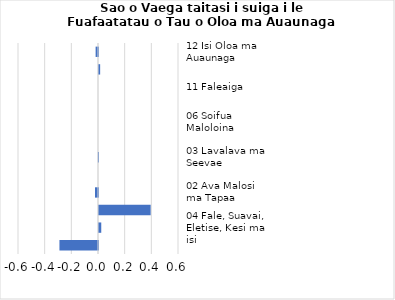
| Category |     Contributions |
|---|---|
| 12 Isi Oloa ma Auaunaga | -0.018 |
| 05 Meafale, Mea Faigaluega mo Faaleleia o Aiga | 0.009 |
| 11 Faleaiga | 0 |
| 10 Aoaoga | 0 |
| 06 Soifua Maloloina | 0 |
| 08 Fesootaiga | 0 |
| 03 Lavalava ma Seevae | -0.001 |
| 09 Faafiafiaga ma Aganuu | 0 |
| 02 Ava Malosi ma Tapaa | -0.023 |
| 07 Femalagaiga | 0.387 |
| 04 Fale, Suavai, Eletise, Kesi ma isi | 0.017 |
| 01 Meaai ma Vaiinu | -0.289 |